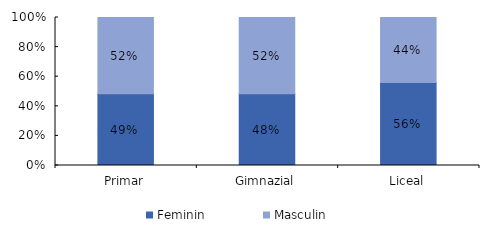
| Category | Feminin | Masculin |
|---|---|---|
| Primar | 48.5 | 51.5 |
| Gimnazial | 48.4 | 51.6 |
| Liceal | 56.1 | 43.9 |